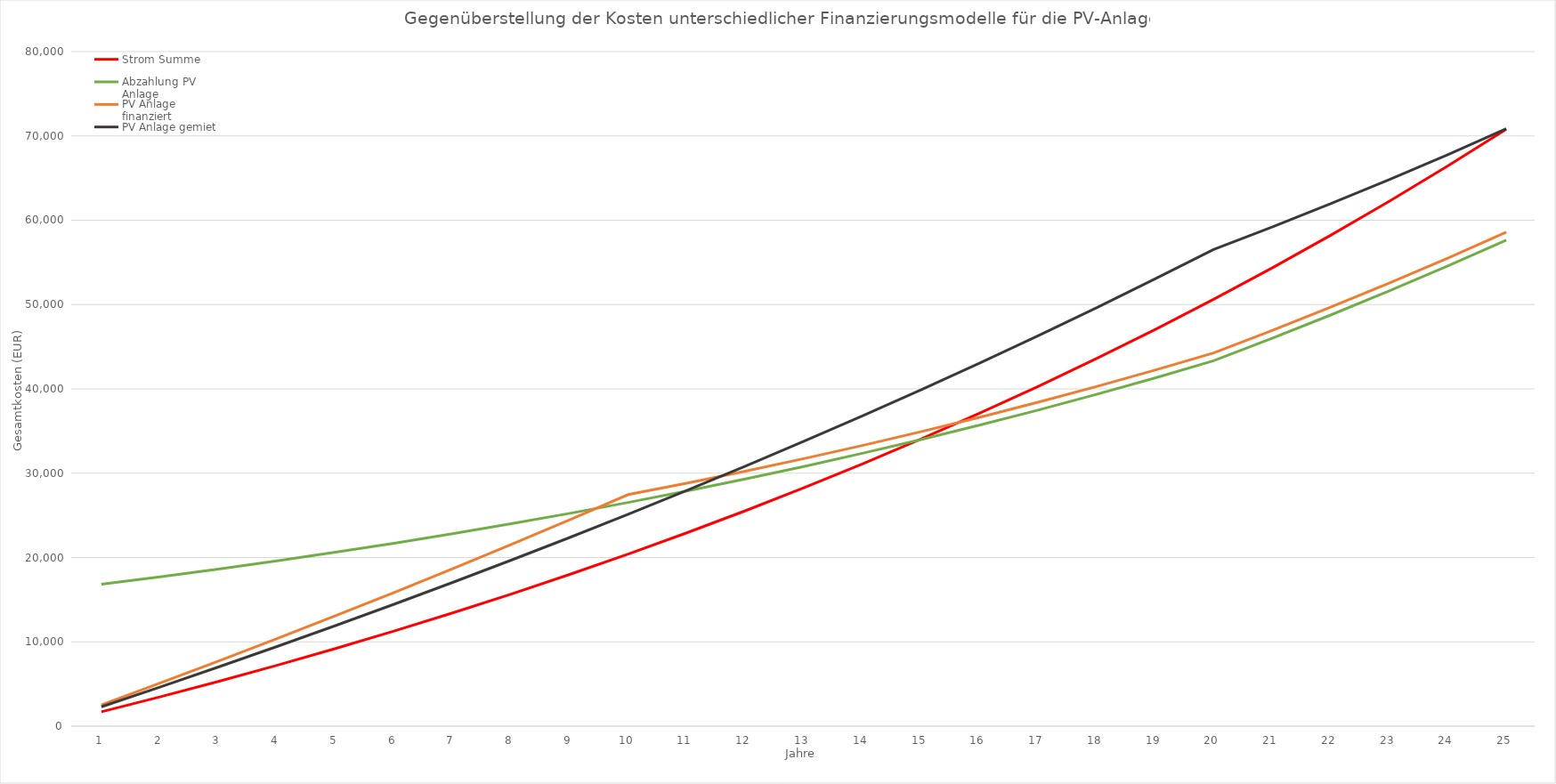
| Category | Strom Summe | Abzahlung PV Anlage | PV Anlage finanziert | PV Anlage gemietet |
|---|---|---|---|---|
| 0 | 1700 | 16835 | 2527.8 | 2295 |
| 1 | 3468 | 17713.52 | 5099.12 | 4633.52 |
| 2 | 5306.72 | 18637.301 | 7715.701 | 7017.301 |
| 3 | 7218.989 | 19608.153 | 10379.353 | 9448.153 |
| 4 | 9207.748 | 20627.959 | 13091.959 | 11927.959 |
| 5 | 11276.058 | 21698.677 | 15855.477 | 14458.677 |
| 6 | 13427.101 | 22822.344 | 18671.944 | 17042.344 |
| 7 | 15664.185 | 24001.078 | 21543.478 | 19681.078 |
| 8 | 17990.752 | 25237.081 | 24472.281 | 22377.081 |
| 9 | 20410.382 | 26532.645 | 27460.645 | 25132.645 |
| 10 | 22926.797 | 27890.15 | 28818.15 | 27950.15 |
| 11 | 25543.869 | 29312.076 | 30240.076 | 30832.076 |
| 12 | 28265.624 | 30800.999 | 31728.999 | 33780.999 |
| 13 | 31096.249 | 32359.599 | 33287.599 | 36799.599 |
| 14 | 34040.099 | 33990.663 | 34918.663 | 39890.663 |
| 15 | 37101.703 | 35697.09 | 36625.09 | 43057.09 |
| 16 | 40285.771 | 37481.893 | 38409.893 | 46301.893 |
| 17 | 43597.202 | 39348.209 | 40276.209 | 49628.209 |
| 18 | 47041.09 | 41299.298 | 42227.298 | 53039.298 |
| 19 | 50622.734 | 43338.549 | 44266.549 | 56538.549 |
| 20 | 54347.643 | 46002.491 | 46930.491 | 59202.491 |
| 21 | 58221.549 | 48761.791 | 49689.791 | 61961.791 |
| 22 | 62250.411 | 51620.263 | 52548.263 | 64820.263 |
| 23 | 66440.427 | 54581.873 | 55509.873 | 67781.873 |
| 24 | 70798.044 | 57650.748 | 58578.748 | 70850.748 |